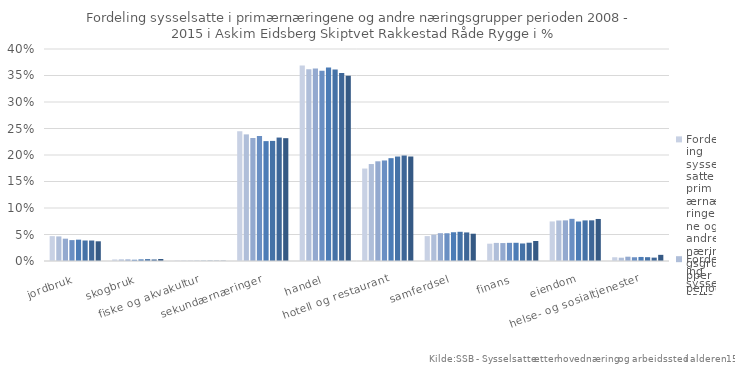
| Category | 2008 | 2009 | 2010 | 2011 | 2012 | 2013 | 2014 | 2015 |
|---|---|---|---|---|---|---|---|---|
| jordbruk | 0.047 | 0.046 | 0.042 | 0.039 | 0.04 | 0.039 | 0.039 | 0.037 |
| skogbruk | 0.003 | 0.003 | 0.003 | 0.002 | 0.003 | 0.004 | 0.003 | 0.004 |
| fiske og akvakultur | 0.001 | 0.001 | 0 | 0 | 0 | 0.001 | 0 | 0 |
| sekundærnæringer | 0.245 | 0.239 | 0.232 | 0.236 | 0.226 | 0.227 | 0.233 | 0.232 |
| handel, hotell og restaurant, samferdsel, finans, eiendom | 0.369 | 0.362 | 0.363 | 0.359 | 0.365 | 0.362 | 0.355 | 0.35 |
| helse- og sosialtjenester | 0.174 | 0.183 | 0.188 | 0.19 | 0.194 | 0.197 | 0.199 | 0.197 |
| off.adm., forsvar, sosialforsikring | 0.047 | 0.05 | 0.052 | 0.052 | 0.054 | 0.055 | 0.054 | 0.051 |
| personlig tjenesteyting | 0.033 | 0.034 | 0.034 | 0.034 | 0.034 | 0.033 | 0.035 | 0.038 |
| undervisning | 0.075 | 0.076 | 0.077 | 0.08 | 0.075 | 0.077 | 0.077 | 0.079 |
| uoppgitt | 0.007 | 0.006 | 0.008 | 0.007 | 0.008 | 0.007 | 0.006 | 0.012 |